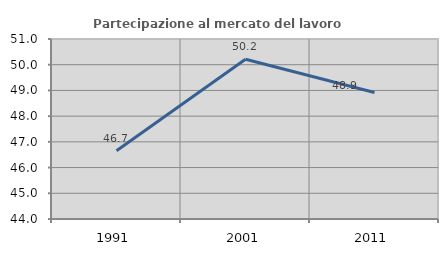
| Category | Partecipazione al mercato del lavoro  femminile |
|---|---|
| 1991.0 | 46.651 |
| 2001.0 | 50.214 |
| 2011.0 | 48.917 |